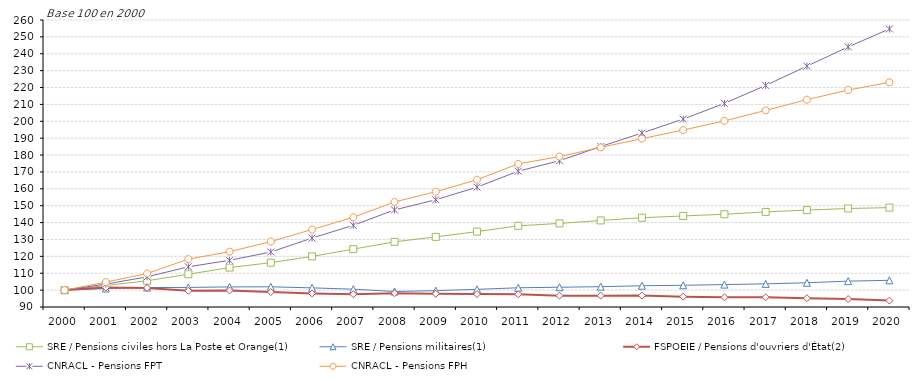
| Category | SRE / Pensions civiles hors La Poste et Orange(1) | SRE / Pensions militaires(1) | FSPOEIE / Pensions d'ouvriers d'État(2) | CNRACL - Pensions FPT | CNRACL - Pensions FPH |
|---|---|---|---|---|---|
| 2000.0 | 100 | 100 | 100 | 100 | 100 |
| 2001.0 | 102.693 | 100.955 | 101.508 | 103.552 | 104.725 |
| 2002.0 | 105.576 | 101.521 | 101.313 | 107.867 | 109.838 |
| 2003.0 | 109.411 | 101.591 | 99.574 | 113.825 | 118.365 |
| 2004.0 | 113.335 | 101.907 | 99.796 | 117.652 | 122.769 |
| 2005.0 | 116.249 | 101.96 | 98.813 | 122.576 | 128.751 |
| 2006.0 | 119.972 | 101.337 | 98.06 | 130.831 | 135.907 |
| 2007.0 | 124.273 | 100.543 | 97.611 | 138.38 | 143.143 |
| 2008.0 | 128.596 | 99.196 | 98.158 | 147.517 | 152.211 |
| 2009.0 | 131.542 | 99.673 | 97.846 | 153.518 | 158.277 |
| 2010.0 | 134.65 | 100.453 | 97.641 | 161 | 165.421 |
| 2011.0 | 138.088 | 101.392 | 97.525 | 170.457 | 174.769 |
| 2012.0 | 139.52 | 101.702 | 96.734 | 176.634 | 179.1 |
| 2013.0 | 141.279 | 102.024 | 96.729 | 185.048 | 184.538 |
| 2014.0 | 142.868 | 102.59 | 96.741 | 193.051 | 189.732 |
| 2015.0 | 143.932 | 102.865 | 96.129 | 201.31 | 194.812 |
| 2016.0 | 144.938 | 103.275 | 95.739 | 210.619 | 200.246 |
| 2017.0 | 146.334 | 103.714 | 95.757 | 221.24 | 206.465 |
| 2018.0 | 147.413 | 104.358 | 95.213 | 232.647 | 212.833 |
| 2019.0 | 148.343 | 105.319 | 94.713 | 244.039 | 218.51 |
| 2020.0 | 148.878 | 105.8 | 93.782 | 254.697 | 223.077 |